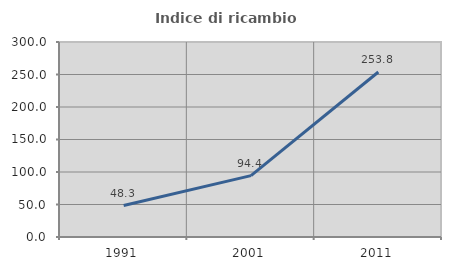
| Category | Indice di ricambio occupazionale  |
|---|---|
| 1991.0 | 48.333 |
| 2001.0 | 94.444 |
| 2011.0 | 253.846 |